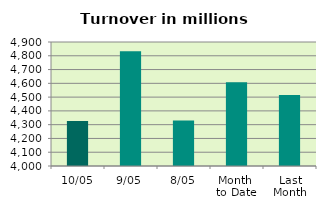
| Category | Series 0 |
|---|---|
| 10/05 | 4325.946 |
| 9/05 | 4833.128 |
| 8/05 | 4330.23 |
| Month 
to Date | 4608.318 |
| Last
Month | 4514.737 |